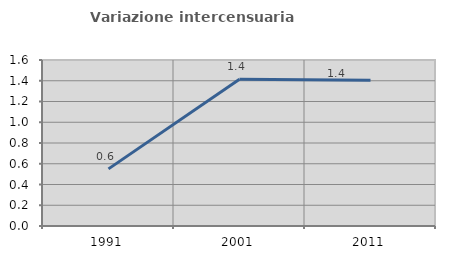
| Category | Variazione intercensuaria annua |
|---|---|
| 1991.0 | 0.551 |
| 2001.0 | 1.415 |
| 2011.0 | 1.406 |